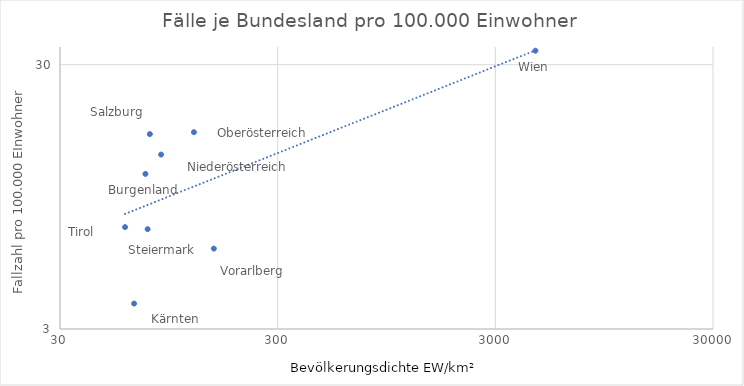
| Category | Fälle pro 100.000 |
|---|---|
| 4583.311594202899 | 33.887 |
| 152.66974240676663 | 6.044 |
| 59.70767405063291 | 7.288 |
| 75.79123224193647 | 7.16 |
| 77.5881777529346 | 16.39 |
| 123.71410684474124 | 16.666 |
| 87.43573438965913 | 13.711 |
| 65.69910986179433 | 3.744 |
| 74.06183745583039 | 11.587 |